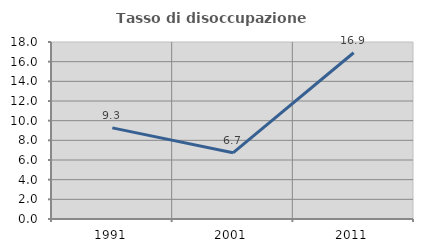
| Category | Tasso di disoccupazione giovanile  |
|---|---|
| 1991.0 | 9.269 |
| 2001.0 | 6.734 |
| 2011.0 | 16.908 |